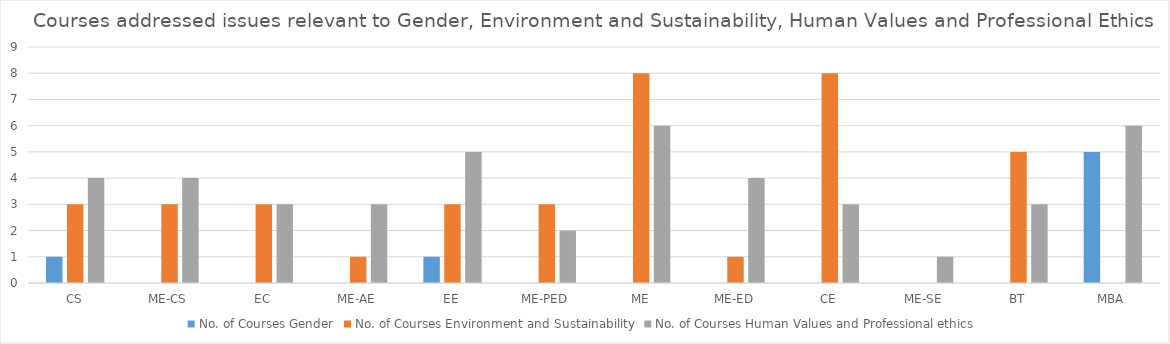
| Category | No. of Courses |
|---|---|
| CS | 4 |
| ME-CS | 4 |
| EC | 3 |
| ME-AE | 3 |
| EE | 5 |
| ME-PED | 2 |
| ME | 6 |
| ME-ED | 4 |
| CE | 3 |
| ME-SE | 1 |
| BT | 3 |
| MBA | 6 |